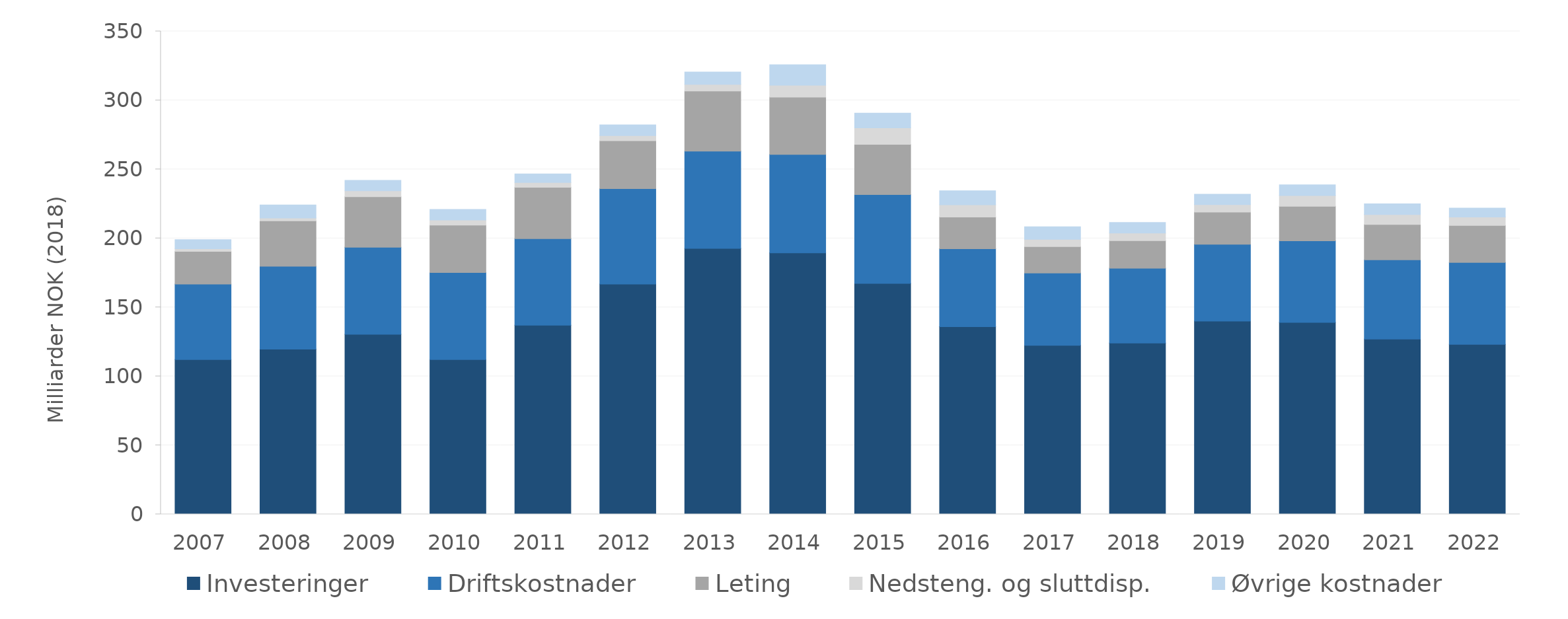
| Category | Investeringer | Driftskostnader | Leting | Nedsteng. og sluttdisp. | Øvrige kostnader |
|---|---|---|---|---|---|
| 2007.0 | 112.216 | 54.606 | 23.682 | 1.963 | 6.54 |
| 2008.0 | 119.715 | 60.024 | 32.958 | 2.057 | 9.465 |
| 2009.0 | 130.506 | 63.036 | 36.634 | 4.306 | 7.532 |
| 2010.0 | 112.198 | 63.037 | 34.332 | 3.79 | 7.549 |
| 2011.0 | 137.025 | 62.763 | 37.163 | 3.491 | 6.24 |
| 2012.0 | 166.9 | 69.176 | 34.627 | 3.751 | 7.788 |
| 2013.0 | 192.666 | 70.523 | 43.582 | 4.75 | 9.087 |
| 2014.0 | 189.483 | 71.4 | 41.526 | 8.619 | 14.784 |
| 2015.0 | 167.382 | 64.391 | 36.322 | 12.006 | 10.695 |
| 2016.0 | 135.99 | 56.519 | 22.979 | 8.863 | 10.158 |
| 2017.0 | 122.392 | 52.448 | 19.22 | 5.241 | 9.065 |
| 2018.0 | 124.134 | 54.198 | 20.035 | 5.488 | 7.709 |
| 2019.0 | 140.068 | 55.596 | 23.346 | 5.427 | 7.517 |
| 2020.0 | 139.077 | 59.093 | 25.013 | 7.815 | 7.829 |
| 2021.0 | 127.056 | 57.403 | 25.564 | 7.211 | 7.781 |
| 2022.0 | 123.159 | 59.388 | 26.772 | 6.137 | 6.457 |